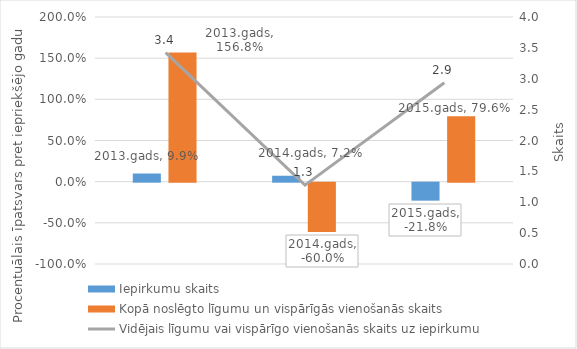
| Category | Iepirkumu skaits | Kopā noslēgto līgumu un vispārīgās vienošanās skaits |
|---|---|---|
| 2013.gads | 0.099 | 1.568 |
| 2014.gads | 0.072 | -0.6 |
| 2015.gads | -0.218 | 0.796 |